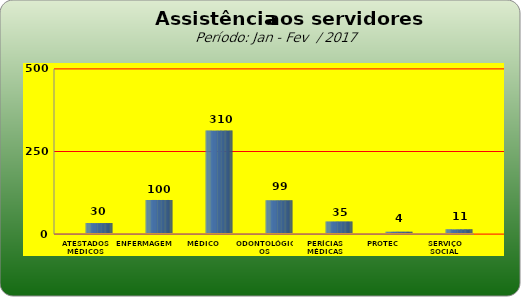
| Category | Series 0 |
|---|---|
| ATESTADOS MÉDICOS | 30 |
| ENFERMAGEM | 100 |
| MÉDICO | 310 |
| ODONTOLÓGICOS | 99 |
| PERÍCIAS MÉDICAS | 35 |
| PROTEC | 4 |
| SERVIÇO SOCIAL | 11 |